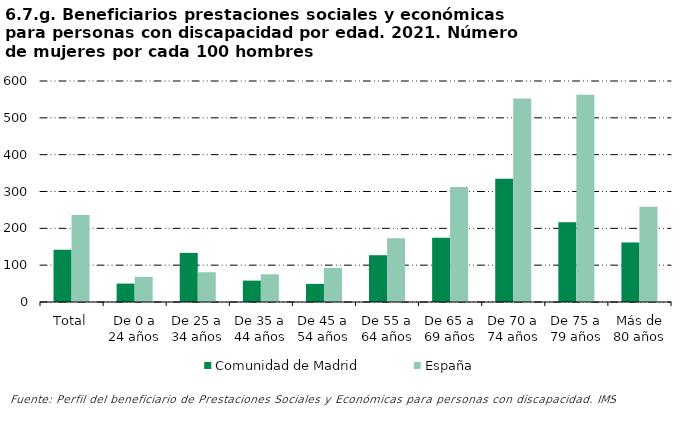
| Category | Comunidad de Madrid | España |
|---|---|---|
| Total | 141.71 | 236.056 |
| De 0 a 24 años | 50 | 68.182 |
| De 25 a 34 años | 133.333 | 80.808 |
| De 35 a 44 años | 58.065 | 75.138 |
| De 45 a 54 años | 49.231 | 92.459 |
| De 55 a 64 años | 127.027 | 173.048 |
| De 65 a 69 años | 174.286 | 312.353 |
| De 70 a 74 años | 334.783 | 552.344 |
| De 75 a 79 años | 216.667 | 562.687 |
| Más de 80 años | 161.739 | 258.45 |